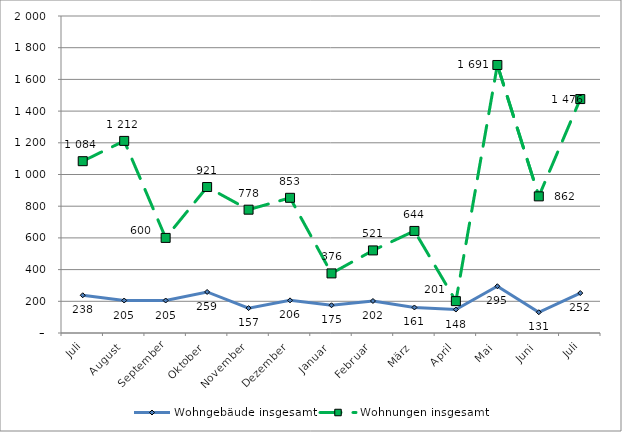
| Category | Wohngebäude insgesamt | Wohnungen insgesamt |
|---|---|---|
| Juli | 238 | 1084 |
| August | 205 | 1212 |
| September | 205 | 600 |
| Oktober | 259 | 921 |
| November | 157 | 778 |
| Dezember | 206 | 853 |
| Januar | 175 | 376 |
| Februar | 202 | 521 |
| März | 161 | 644 |
| April | 148 | 201 |
| Mai | 295 | 1691 |
| Juni | 131 | 862 |
| Juli | 252 | 1476 |